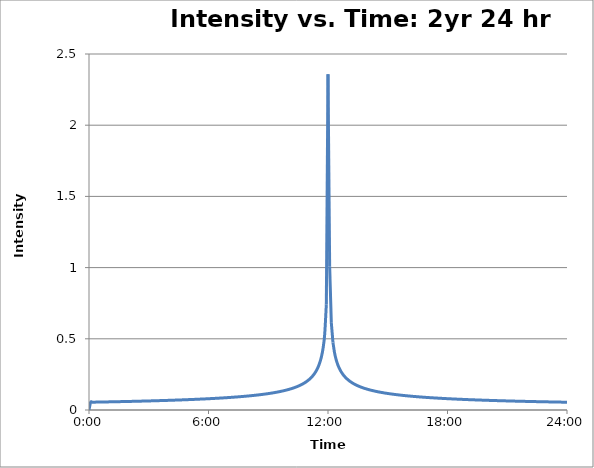
| Category | HCE (CAP) Design Storms |
|---|---|
| 0.0 | 0 |
| 0.003472222222222222 | 0.055 |
| 0.006944444444444444 | 0.055 |
| 0.0104166666666667 | 0.055 |
| 0.0138888888888889 | 0.055 |
| 0.0173611111111111 | 0.056 |
| 0.0208333333333333 | 0.056 |
| 0.0243055555555556 | 0.056 |
| 0.0277777777777778 | 0.056 |
| 0.03125 | 0.056 |
| 0.0347222222222222 | 0.057 |
| 0.0381944444444444 | 0.057 |
| 0.0416666666666667 | 0.057 |
| 0.0451388888888889 | 0.057 |
| 0.0486111111111111 | 0.058 |
| 0.0520833333333333 | 0.058 |
| 0.0555555555555556 | 0.058 |
| 0.0590277777777778 | 0.058 |
| 0.0625 | 0.058 |
| 0.0659722222222222 | 0.059 |
| 0.0694444444444444 | 0.059 |
| 0.0729166666666667 | 0.059 |
| 0.0763888888888889 | 0.06 |
| 0.0798611111111111 | 0.06 |
| 0.0833333333333333 | 0.06 |
| 0.0868055555555556 | 0.06 |
| 0.0902777777777778 | 0.061 |
| 0.09375 | 0.061 |
| 0.0972222222222222 | 0.061 |
| 0.100694444444444 | 0.062 |
| 0.104166666666667 | 0.062 |
| 0.107638888888889 | 0.062 |
| 0.111111111111111 | 0.062 |
| 0.114583333333333 | 0.063 |
| 0.118055555555556 | 0.063 |
| 0.121527777777778 | 0.063 |
| 0.125 | 0.064 |
| 0.128472222222222 | 0.064 |
| 0.131944444444444 | 0.064 |
| 0.135416666666667 | 0.065 |
| 0.138888888888889 | 0.065 |
| 0.142361111111111 | 0.065 |
| 0.145833333333333 | 0.066 |
| 0.149305555555556 | 0.066 |
| 0.152777777777778 | 0.066 |
| 0.15625 | 0.067 |
| 0.159722222222222 | 0.067 |
| 0.163194444444444 | 0.067 |
| 0.166666666666667 | 0.068 |
| 0.170138888888889 | 0.068 |
| 0.173611111111111 | 0.069 |
| 0.177083333333333 | 0.069 |
| 0.180555555555556 | 0.069 |
| 0.184027777777778 | 0.07 |
| 0.1875 | 0.07 |
| 0.190972222222222 | 0.071 |
| 0.194444444444444 | 0.071 |
| 0.197916666666667 | 0.072 |
| 0.201388888888889 | 0.072 |
| 0.204861111111111 | 0.072 |
| 0.208333333333333 | 0.073 |
| 0.211805555555556 | 0.073 |
| 0.215277777777778 | 0.074 |
| 0.21875 | 0.074 |
| 0.222222222222222 | 0.075 |
| 0.225694444444444 | 0.075 |
| 0.229166666666667 | 0.076 |
| 0.232638888888889 | 0.076 |
| 0.236111111111111 | 0.077 |
| 0.239583333333333 | 0.078 |
| 0.243055555555556 | 0.078 |
| 0.246527777777778 | 0.079 |
| 0.25 | 0.079 |
| 0.253472222222222 | 0.08 |
| 0.256944444444444 | 0.08 |
| 0.260416666666667 | 0.081 |
| 0.263888888888889 | 0.082 |
| 0.267361111111111 | 0.082 |
| 0.270833333333333 | 0.083 |
| 0.274305555555556 | 0.084 |
| 0.277777777777778 | 0.084 |
| 0.28125 | 0.085 |
| 0.284722222222222 | 0.086 |
| 0.288194444444444 | 0.087 |
| 0.291666666666667 | 0.087 |
| 0.295138888888889 | 0.088 |
| 0.298611111111111 | 0.089 |
| 0.302083333333333 | 0.09 |
| 0.305555555555556 | 0.091 |
| 0.309027777777778 | 0.092 |
| 0.3125 | 0.092 |
| 0.315972222222222 | 0.094 |
| 0.319444444444444 | 0.094 |
| 0.322916666666667 | 0.095 |
| 0.326388888888889 | 0.096 |
| 0.329861111111111 | 0.098 |
| 0.333333333333333 | 0.099 |
| 0.336805555555556 | 0.1 |
| 0.340277777777778 | 0.101 |
| 0.34375 | 0.102 |
| 0.347222222222222 | 0.103 |
| 0.350694444444444 | 0.105 |
| 0.354166666666667 | 0.106 |
| 0.357638888888889 | 0.107 |
| 0.361111111111111 | 0.109 |
| 0.364583333333333 | 0.11 |
| 0.368055555555556 | 0.112 |
| 0.371527777777778 | 0.114 |
| 0.375 | 0.115 |
| 0.378472222222222 | 0.117 |
| 0.381944444444444 | 0.119 |
| 0.385416666666667 | 0.121 |
| 0.388888888888889 | 0.123 |
| 0.392361111111111 | 0.125 |
| 0.395833333333333 | 0.127 |
| 0.399305555555556 | 0.129 |
| 0.402777777777778 | 0.132 |
| 0.40625 | 0.134 |
| 0.409722222222222 | 0.137 |
| 0.413194444444444 | 0.14 |
| 0.416666666666667 | 0.143 |
| 0.420138888888889 | 0.147 |
| 0.423611111111111 | 0.15 |
| 0.427083333333333 | 0.154 |
| 0.430555555555556 | 0.158 |
| 0.434027777777778 | 0.162 |
| 0.4375 | 0.167 |
| 0.440972222222222 | 0.172 |
| 0.444444444444444 | 0.178 |
| 0.447916666666667 | 0.184 |
| 0.451388888888889 | 0.191 |
| 0.454861111111111 | 0.199 |
| 0.458333333333333 | 0.208 |
| 0.461805555555556 | 0.218 |
| 0.465277777777778 | 0.229 |
| 0.46875 | 0.242 |
| 0.472222222222222 | 0.258 |
| 0.475694444444444 | 0.277 |
| 0.479166666666667 | 0.3 |
| 0.482638888888889 | 0.331 |
| 0.486111111111111 | 0.372 |
| 0.489583333333333 | 0.432 |
| 0.493055555555556 | 0.53 |
| 0.496527777777778 | 0.743 |
| 0.5 | 2.357 |
| 0.503472222222222 | 1.009 |
| 0.506944444444444 | 0.612 |
| 0.510416666666667 | 0.474 |
| 0.513888888888889 | 0.398 |
| 0.517361111111111 | 0.35 |
| 0.520833333333333 | 0.315 |
| 0.524305555555556 | 0.288 |
| 0.527777777777778 | 0.267 |
| 0.53125 | 0.25 |
| 0.534722222222222 | 0.236 |
| 0.538194444444444 | 0.223 |
| 0.541666666666667 | 0.213 |
| 0.545138888888889 | 0.203 |
| 0.548611111111111 | 0.195 |
| 0.552083333333333 | 0.188 |
| 0.555555555555556 | 0.181 |
| 0.559027777777778 | 0.175 |
| 0.5625 | 0.17 |
| 0.565972222222222 | 0.165 |
| 0.569444444444444 | 0.16 |
| 0.572916666666667 | 0.156 |
| 0.576388888888889 | 0.152 |
| 0.579861111111111 | 0.148 |
| 0.583333333333333 | 0.145 |
| 0.586805555555555 | 0.142 |
| 0.590277777777778 | 0.139 |
| 0.59375 | 0.136 |
| 0.597222222222222 | 0.133 |
| 0.600694444444444 | 0.131 |
| 0.604166666666667 | 0.128 |
| 0.607638888888889 | 0.126 |
| 0.611111111111111 | 0.124 |
| 0.614583333333333 | 0.122 |
| 0.618055555555555 | 0.12 |
| 0.621527777777778 | 0.118 |
| 0.625 | 0.116 |
| 0.628472222222222 | 0.114 |
| 0.631944444444444 | 0.113 |
| 0.635416666666667 | 0.111 |
| 0.638888888888889 | 0.11 |
| 0.642361111111111 | 0.108 |
| 0.645833333333333 | 0.107 |
| 0.649305555555555 | 0.105 |
| 0.652777777777778 | 0.104 |
| 0.65625 | 0.103 |
| 0.659722222222222 | 0.102 |
| 0.663194444444444 | 0.1 |
| 0.666666666666667 | 0.099 |
| 0.670138888888889 | 0.098 |
| 0.673611111111111 | 0.097 |
| 0.677083333333333 | 0.096 |
| 0.680555555555555 | 0.095 |
| 0.684027777777778 | 0.094 |
| 0.6875 | 0.093 |
| 0.690972222222222 | 0.092 |
| 0.694444444444444 | 0.091 |
| 0.697916666666667 | 0.09 |
| 0.701388888888889 | 0.089 |
| 0.704861111111111 | 0.089 |
| 0.708333333333333 | 0.088 |
| 0.711805555555555 | 0.087 |
| 0.715277777777778 | 0.086 |
| 0.71875 | 0.086 |
| 0.722222222222222 | 0.085 |
| 0.725694444444444 | 0.084 |
| 0.729166666666667 | 0.083 |
| 0.732638888888889 | 0.083 |
| 0.736111111111111 | 0.082 |
| 0.739583333333333 | 0.081 |
| 0.743055555555555 | 0.081 |
| 0.746527777777778 | 0.08 |
| 0.75 | 0.08 |
| 0.753472222222222 | 0.079 |
| 0.756944444444444 | 0.078 |
| 0.760416666666667 | 0.078 |
| 0.763888888888889 | 0.077 |
| 0.767361111111111 | 0.077 |
| 0.770833333333333 | 0.076 |
| 0.774305555555555 | 0.076 |
| 0.777777777777778 | 0.075 |
| 0.78125 | 0.075 |
| 0.784722222222222 | 0.074 |
| 0.788194444444444 | 0.074 |
| 0.791666666666667 | 0.073 |
| 0.795138888888889 | 0.073 |
| 0.798611111111111 | 0.072 |
| 0.802083333333333 | 0.072 |
| 0.805555555555555 | 0.071 |
| 0.809027777777778 | 0.071 |
| 0.8125 | 0.07 |
| 0.815972222222222 | 0.07 |
| 0.819444444444444 | 0.07 |
| 0.822916666666667 | 0.069 |
| 0.826388888888889 | 0.069 |
| 0.829861111111111 | 0.068 |
| 0.833333333333333 | 0.068 |
| 0.836805555555555 | 0.068 |
| 0.840277777777778 | 0.067 |
| 0.84375 | 0.067 |
| 0.847222222222222 | 0.066 |
| 0.850694444444444 | 0.066 |
| 0.854166666666667 | 0.066 |
| 0.857638888888889 | 0.065 |
| 0.861111111111111 | 0.065 |
| 0.864583333333333 | 0.065 |
| 0.868055555555555 | 0.064 |
| 0.871527777777778 | 0.064 |
| 0.875 | 0.064 |
| 0.878472222222222 | 0.064 |
| 0.881944444444444 | 0.063 |
| 0.885416666666667 | 0.063 |
| 0.888888888888889 | 0.062 |
| 0.892361111111111 | 0.062 |
| 0.895833333333333 | 0.062 |
| 0.899305555555555 | 0.062 |
| 0.902777777777778 | 0.061 |
| 0.90625 | 0.061 |
| 0.909722222222222 | 0.061 |
| 0.913194444444444 | 0.06 |
| 0.916666666666667 | 0.06 |
| 0.920138888888889 | 0.06 |
| 0.923611111111111 | 0.06 |
| 0.927083333333333 | 0.059 |
| 0.930555555555555 | 0.059 |
| 0.934027777777778 | 0.059 |
| 0.9375 | 0.059 |
| 0.940972222222222 | 0.058 |
| 0.944444444444444 | 0.058 |
| 0.947916666666667 | 0.058 |
| 0.951388888888889 | 0.058 |
| 0.954861111111111 | 0.057 |
| 0.958333333333333 | 0.057 |
| 0.961805555555555 | 0.057 |
| 0.965277777777778 | 0.057 |
| 0.96875 | 0.056 |
| 0.972222222222222 | 0.056 |
| 0.975694444444444 | 0.056 |
| 0.979166666666667 | 0.056 |
| 0.982638888888889 | 0.056 |
| 0.986111111111111 | 0.055 |
| 0.989583333333333 | 0.055 |
| 0.993055555555555 | 0.055 |
| 0.996527777777778 | 0.055 |
| 1.0 | 0.055 |